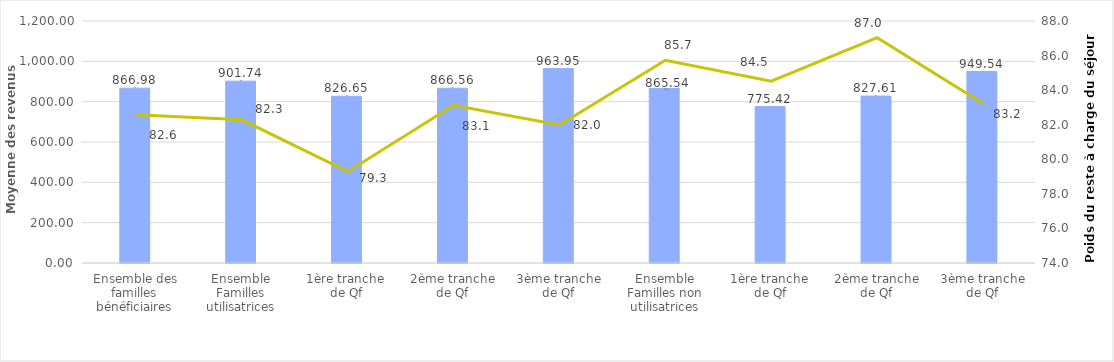
| Category | Series 0 |
|---|---|
| 0 | 866.98 |
| 1 | 901.74 |
| 2 | 826.65 |
| 3 | 866.56 |
| 4 | 963.95 |
| 5 | 865.54 |
| 6 | 775.42 |
| 7 | 827.61 |
| 8 | 949.54 |